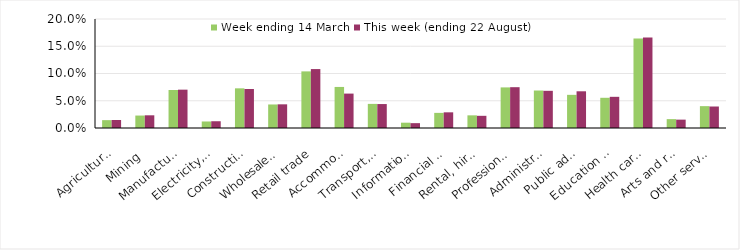
| Category | Week ending 14 March | This week (ending 22 August) |
|---|---|---|
| Agriculture, forestry and fishing | 0.014 | 0.015 |
| Mining | 0.023 | 0.023 |
| Manufacturing | 0.07 | 0.07 |
| Electricity, gas, water and waste services | 0.012 | 0.012 |
| Construction | 0.073 | 0.072 |
| Wholesale trade | 0.043 | 0.043 |
| Retail trade | 0.104 | 0.108 |
| Accommodation and food services | 0.075 | 0.063 |
| Transport, postal and warehousing | 0.044 | 0.044 |
| Information media and telecommunications | 0.01 | 0.009 |
| Financial and insurance services | 0.028 | 0.029 |
| Rental, hiring and real estate services | 0.023 | 0.022 |
| Professional, scientific and technical services | 0.074 | 0.075 |
| Administrative and support services | 0.069 | 0.068 |
| Public administration and safety | 0.061 | 0.067 |
| Education and training | 0.055 | 0.057 |
| Health care and social assistance | 0.164 | 0.166 |
| Arts and recreation services | 0.016 | 0.015 |
| Other services | 0.04 | 0.039 |